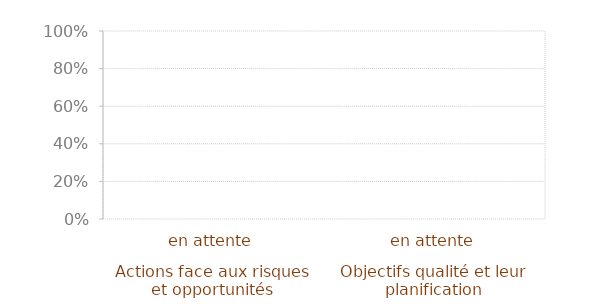
| Category | Article 6 |
|---|---|
| 0 | 0 |
| 1 | 0 |